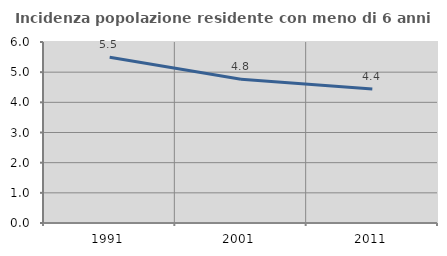
| Category | Incidenza popolazione residente con meno di 6 anni |
|---|---|
| 1991.0 | 5.492 |
| 2001.0 | 4.762 |
| 2011.0 | 4.438 |